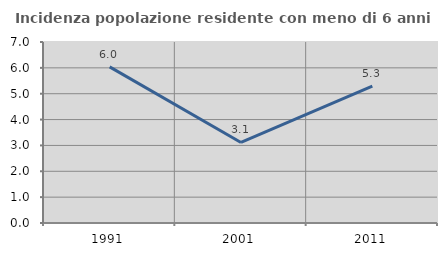
| Category | Incidenza popolazione residente con meno di 6 anni |
|---|---|
| 1991.0 | 6.037 |
| 2001.0 | 3.114 |
| 2011.0 | 5.291 |